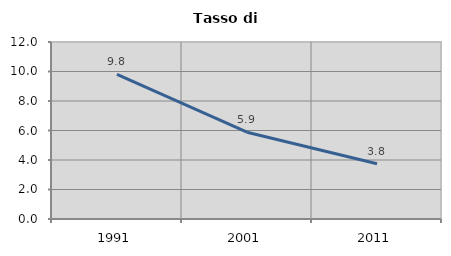
| Category | Tasso di disoccupazione   |
|---|---|
| 1991.0 | 9.804 |
| 2001.0 | 5.882 |
| 2011.0 | 3.75 |